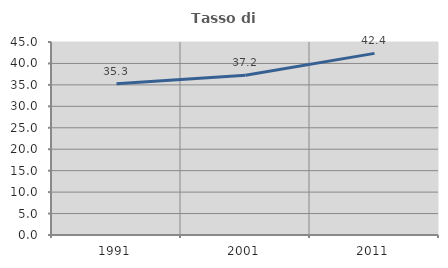
| Category | Tasso di occupazione   |
|---|---|
| 1991.0 | 35.284 |
| 2001.0 | 37.233 |
| 2011.0 | 42.351 |